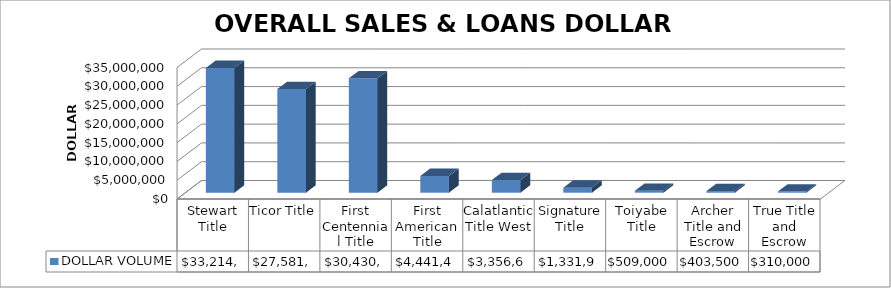
| Category | DOLLAR VOLUME |
|---|---|
| Stewart Title | 33214699 |
| Ticor Title | 27581896 |
| First Centennial Title | 30430084 |
| First American Title | 4441437 |
| Calatlantic Title West | 3356603 |
| Signature Title | 1331900 |
| Toiyabe Title | 509000 |
| Archer Title and Escrow | 403500 |
| True Title and Escrow | 310000 |